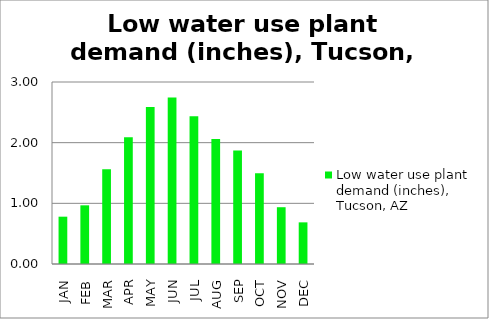
| Category | Low water use plant demand (inches), Tucson, AZ  |
|---|---|
| JAN | 0.78 |
| FEB | 0.967 |
| MAR | 1.56 |
| APR | 2.09 |
| MAY | 2.59 |
| JUN | 2.746 |
| JUL | 2.434 |
| AUG | 2.059 |
| SEP | 1.872 |
| OCT | 1.498 |
| NOV | 0.936 |
| DEC | 0.686 |